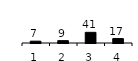
| Category | Series 0 |
|---|---|
| 1.0 | 7 |
| 2.0 | 9 |
| 3.0 | 41 |
| 4.0 | 17 |